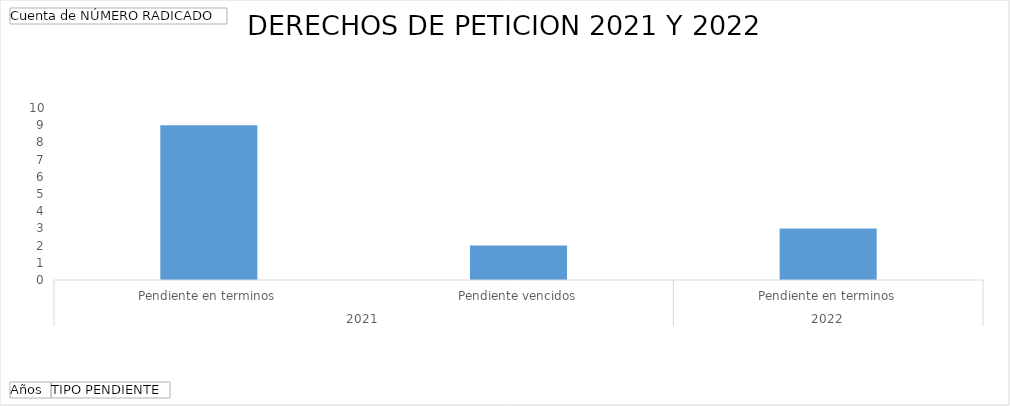
| Category | Total |
|---|---|
| 0 | 9 |
| 1 | 2 |
| 2 | 3 |